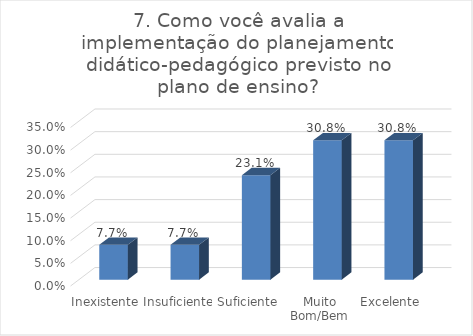
| Category | 7. Como você avalia a implementação do planejamento didático-pedagógico previsto no plano de ensino? |
|---|---|
| Inexistente | 0.077 |
| Insuficiente | 0.077 |
| Suficiente | 0.231 |
| Muito Bom/Bem | 0.308 |
| Excelente | 0.308 |